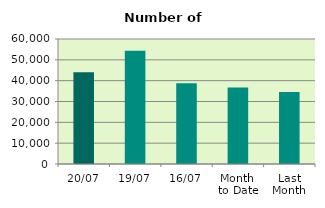
| Category | Series 0 |
|---|---|
| 20/07 | 44010 |
| 19/07 | 54364 |
| 16/07 | 38772 |
| Month 
to Date | 36755.286 |
| Last
Month | 34545 |